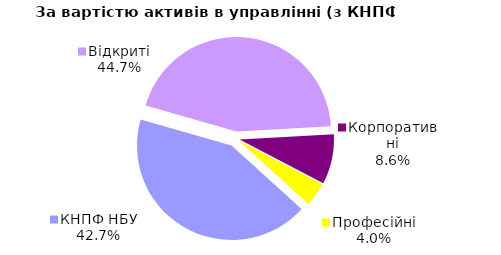
| Category | Series 0 |
|---|---|
| Відкриті | 1795.917 |
| Корпоративні | 345.245 |
| Професійні | 162.203 |
| КНПФ НБУ | 1718.816 |